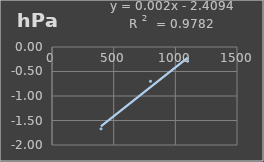
| Category | Presión Atmosférica |
|---|---|
| 397.5 | -1.67 |
| 798.5 | -0.7 |
| 1099.6 | -0.29 |